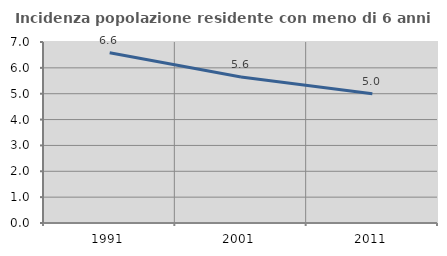
| Category | Incidenza popolazione residente con meno di 6 anni |
|---|---|
| 1991.0 | 6.586 |
| 2001.0 | 5.644 |
| 2011.0 | 4.995 |